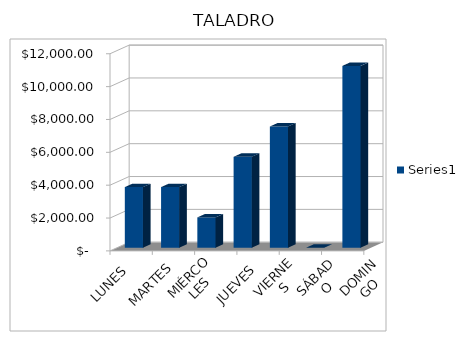
| Category | Series 0 |
|---|---|
| LUNES | 3690 |
| MARTES | 3690 |
| MIÉRCOLES | 1845 |
| JUEVES | 5535 |
| VIERNES | 7380 |
| SÁBADO | 0 |
| DOMINGO | 11070 |